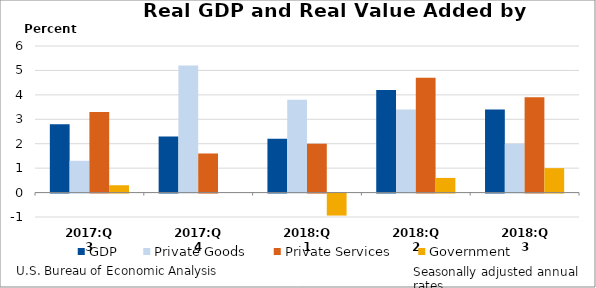
| Category | GDP | Private Goods | Private Services | Government |
|---|---|---|---|---|
| 2017:Q3 | 2.8 | 1.3 | 3.3 | 0.3 |
| 2017:Q4 | 2.3 | 5.2 | 1.6 | 0 |
| 2018:Q1 | 2.2 | 3.8 | 2 | -0.9 |
| 2018:Q2 | 4.2 | 3.4 | 4.7 | 0.6 |
| 2018:Q3 | 3.4 | 2 | 3.9 | 1 |